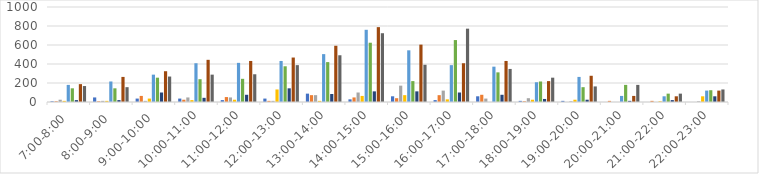
| Category | Series 0 | Series 1 | Series 2 | Series 3 | Series 4 | Series 5 | Series 6 | Series 7 | Series 8 |
|---|---|---|---|---|---|---|---|---|---|
| 7:00-8:00 | 8 | 8 | 24 | 12 | 180 | 144 | 20 | 188 | 168 |
| 8:00-9:00 | 48 | 8 | 12 | 12 | 216 | 144 | 20 | 264 | 156 |
| 9:00-10:00 | 36 | 64 | 12 | 36 | 288 | 256 | 100 | 324 | 268 |
| 10:00-11:00 | 36 | 24 | 48 | 20 | 408 | 240 | 44 | 444 | 288 |
| 11:00-12:00 | 20 | 52 | 48 | 24 | 412 | 244 | 76 | 432 | 292 |
| 12:00-13:00 | 36 | 12 | 12 | 132 | 432 | 376 | 144 | 468 | 388 |
| 13:00-14:00 | 88 | 72 | 72 | 12 | 504 | 420 | 84 | 592 | 492 |
| 14:00-15:00 | 28 | 48 | 100 | 64 | 760 | 624 | 112 | 788 | 724 |
| 15:00-16:00 | 60 | 40 | 172 | 72 | 544 | 220 | 112 | 604 | 392 |
| 16:00-17:00 | 20 | 72 | 120 | 28 | 388 | 652 | 100 | 408 | 772 |
| 17:00-18:00 | 60 | 76 | 36 | 0 | 372 | 312 | 76 | 432 | 348 |
| 18:00-19:00 | 12 | 8 | 40 | 24 | 208 | 216 | 32 | 220 | 256 |
| 19:00-20:00 | 12 | 0 | 8 | 24 | 264 | 156 | 24 | 276 | 164 |
| 20:00-21:00 | 0 | 12 | 0 | 0 | 64 | 180 | 12 | 64 | 180 |
| 21:00-22:00 | 0 | 12 | 0 | 8 | 60 | 88 | 20 | 60 | 88 |
| 22:00-23:00 | 0 | 0 | 8 | 60 | 120 | 124 | 60 | 120 | 132 |